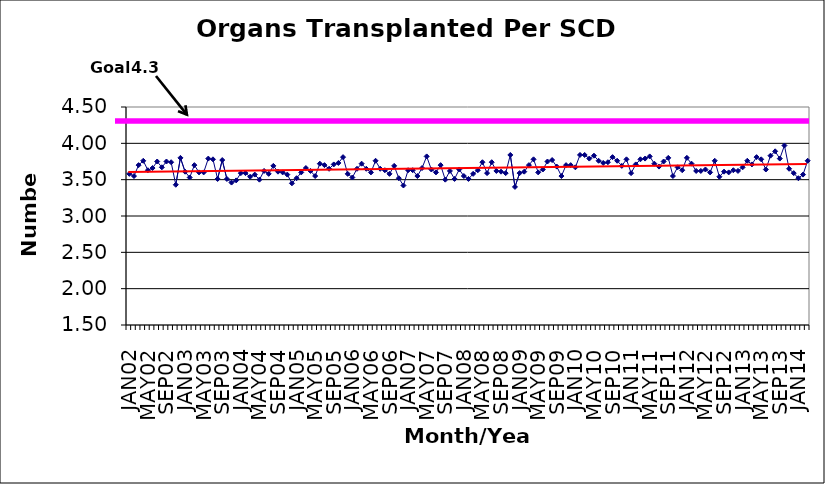
| Category | Series 0 |
|---|---|
| JAN02 | 3.58 |
| FEB02 | 3.55 |
| MAR02 | 3.7 |
| APR02 | 3.76 |
| MAY02 | 3.63 |
| JUN02 | 3.66 |
| JUL02 | 3.75 |
| AUG02 | 3.67 |
| SEP02 | 3.75 |
| OCT02 | 3.74 |
| NOV02 | 3.43 |
| DEC02 | 3.8 |
| JAN03 | 3.61 |
| FEB03 | 3.53 |
| MAR03 | 3.7 |
| APR03 | 3.6 |
| MAY03 | 3.6 |
| JUN03 | 3.79 |
| JUL03 | 3.78 |
| AUG03 | 3.51 |
| SEP03 | 3.77 |
| OCT03 | 3.51 |
| NOV03 | 3.46 |
| DEC03 | 3.49 |
| JAN04 | 3.59 |
| FEB04 | 3.59 |
| MAR04 | 3.54 |
| APR04 | 3.57 |
| MAY04 | 3.5 |
| JUN04 | 3.62 |
| JUL04 | 3.58 |
| AUG04 | 3.69 |
| SEP04 | 3.61 |
| OCT04 | 3.6 |
| NOV04 | 3.57 |
| DEC04 | 3.45 |
| JAN05 | 3.52 |
| FEB05 | 3.6 |
| MAR05 | 3.66 |
| APR05 | 3.62 |
| MAY05 | 3.55 |
| JUN05 | 3.72 |
| JUL05 | 3.7 |
| AUG05 | 3.65 |
| SEP05 | 3.71 |
| OCT05 | 3.73 |
| NOV05 | 3.81 |
| DEC05 | 3.58 |
| JAN06 | 3.53 |
| FEB06 | 3.65 |
| MAR06 | 3.72 |
| APR06 | 3.65 |
| MAY06 | 3.6 |
| JUN06 | 3.76 |
| JUL06 | 3.65 |
| AUG06 | 3.63 |
| SEP06 | 3.58 |
| OCT06 | 3.69 |
| NOV06 | 3.52 |
| DEC06 | 3.42 |
| JAN07 | 3.63 |
| FEB07 | 3.63 |
| MAR07 | 3.55 |
| APR07 | 3.66 |
| MAY07 | 3.82 |
| JUN07 | 3.64 |
| JUL07 | 3.6 |
| AUG07 | 3.7 |
| SEP07 | 3.5 |
| OCT07 | 3.62 |
| NOV07 | 3.51 |
| DEC07 | 3.64 |
| JAN08 | 3.55 |
| FEB08 | 3.51 |
| MAR08 | 3.58 |
| APR08 | 3.63 |
| MAY08 | 3.74 |
| JUN08 | 3.59 |
| JUL08 | 3.74 |
| AUG08 | 3.62 |
| SEP08 | 3.61 |
| OCT08 | 3.59 |
| NOV08 | 3.84 |
| DEC08 | 3.4 |
| JAN09 | 3.59 |
| FEB09 | 3.61 |
| MAR09 | 3.7 |
| APR09 | 3.78 |
| MAY09 | 3.6 |
| JUN09 | 3.64 |
| JUL09 | 3.75 |
| AUG09 | 3.77 |
| SEP09 | 3.68 |
| OCT09 | 3.55 |
| NOV09 | 3.7 |
| DEC09 | 3.7 |
| JAN10 | 3.67 |
| FEB10 | 3.84 |
| MAR10 | 3.84 |
| APR10 | 3.79 |
| MAY10 | 3.83 |
| JUN10 | 3.76 |
| JUL10 | 3.73 |
| AUG10 | 3.74 |
| SEP10 | 3.81 |
| OCT10 | 3.76 |
| NOV10 | 3.69 |
| DEC10 | 3.78 |
| JAN11 | 3.59 |
| FEB11 | 3.71 |
| MAR11 | 3.78 |
| APR11 | 3.79 |
| MAY11 | 3.82 |
| JUN11 | 3.72 |
| JUL11 | 3.68 |
| AUG11 | 3.75 |
| SEP11 | 3.8 |
| OCT11 | 3.55 |
| NOV11 | 3.67 |
| DEC11 | 3.63 |
| JAN12 | 3.8 |
| FEB12 | 3.72 |
| MAR12 | 3.62 |
| APR12 | 3.62 |
| MAY12 | 3.64 |
| JUN12 | 3.6 |
| JUL12 | 3.76 |
| AUG12 | 3.54 |
| SEP12 | 3.61 |
| OCT12 | 3.6 |
| NOV12 | 3.63 |
| DEC12 | 3.62 |
| JAN13 | 3.67 |
| FEB13 | 3.76 |
| MAR13 | 3.71 |
| APR13 | 3.81 |
| MAY13 | 3.78 |
| JUN13 | 3.64 |
| JUL13 | 3.83 |
| AUG13 | 3.89 |
| SEP13 | 3.79 |
| OCT13 | 3.97 |
| NOV13 | 3.65 |
| DEC13 | 3.59 |
| JAN14 | 3.52 |
| FEB14 | 3.57 |
| MAR14 | 3.76 |